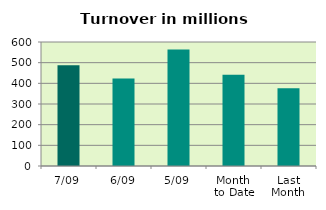
| Category | Series 0 |
|---|---|
| 7/09 | 487.232 |
| 6/09 | 423.589 |
| 5/09 | 563.149 |
| Month 
to Date | 441.581 |
| Last
Month | 376.258 |